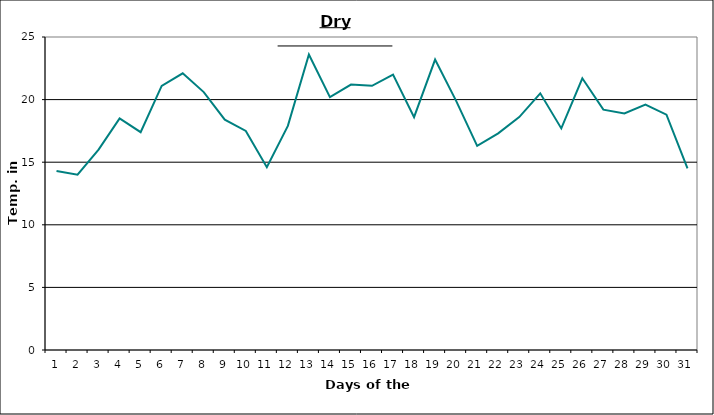
| Category | Series 0 |
|---|---|
| 0 | 14.3 |
| 1 | 14 |
| 2 | 16 |
| 3 | 18.5 |
| 4 | 17.4 |
| 5 | 21.1 |
| 6 | 22.1 |
| 7 | 20.6 |
| 8 | 18.4 |
| 9 | 17.5 |
| 10 | 14.6 |
| 11 | 17.9 |
| 12 | 23.6 |
| 13 | 20.2 |
| 14 | 21.2 |
| 15 | 21.1 |
| 16 | 22 |
| 17 | 18.6 |
| 18 | 23.2 |
| 19 | 19.9 |
| 20 | 16.3 |
| 21 | 17.3 |
| 22 | 18.6 |
| 23 | 20.5 |
| 24 | 17.7 |
| 25 | 21.7 |
| 26 | 19.2 |
| 27 | 18.9 |
| 28 | 19.6 |
| 29 | 18.8 |
| 30 | 14.5 |